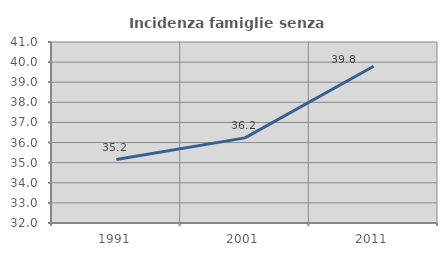
| Category | Incidenza famiglie senza nuclei |
|---|---|
| 1991.0 | 35.156 |
| 2001.0 | 36.232 |
| 2011.0 | 39.794 |